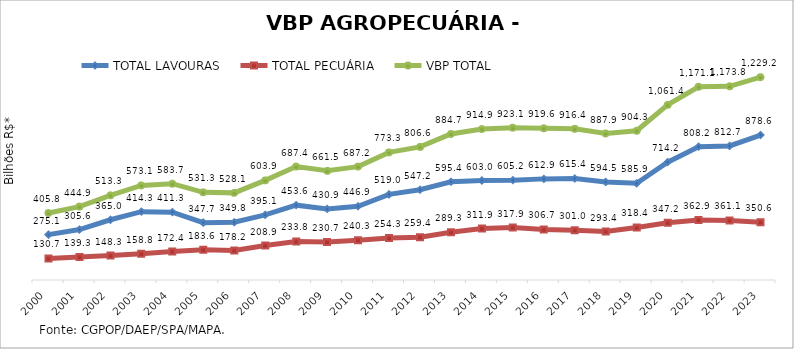
| Category | TOTAL LAVOURAS | TOTAL PECUÁRIA | VBP TOTAL |
|---|---|---|---|
| 2000 | 275.086 | 130.741 | 405.827 |
| 2001 | 305.57 | 139.313 | 444.883 |
| 2002 | 365.014 | 148.29 | 513.304 |
| 2003 | 414.288 | 158.839 | 573.126 |
| 2004 | 411.254 | 172.426 | 583.68 |
| 2005 | 347.697 | 183.6 | 531.298 |
| 2006 | 349.821 | 178.233 | 528.054 |
| 2007 | 395.059 | 208.851 | 603.91 |
| 2008 | 453.626 | 233.768 | 687.394 |
| 2009 | 430.884 | 230.662 | 661.546 |
| 2010 | 446.875 | 240.278 | 687.152 |
| 2011 | 518.99 | 254.292 | 773.282 |
| 2012 | 547.212 | 259.362 | 806.574 |
| 2013 | 595.37 | 289.335 | 884.705 |
| 2014 | 603.03 | 311.869 | 914.899 |
| 2015 | 605.218 | 317.861 | 923.079 |
| 2016 | 612.871 | 306.703 | 919.574 |
| 2017 | 615.415 | 300.958 | 916.373 |
| 2018 | 594.457 | 293.41 | 887.866 |
| 2019 | 585.908 | 318.405 | 904.313 |
| 2020 | 714.236 | 347.174 | 1061.409 |
| 2021 | 808.175 | 362.924 | 1171.099 |
| 2022 | 812.722 | 361.053 | 1173.775 |
| 2023 | 878.622 | 350.575 | 1229.198 |